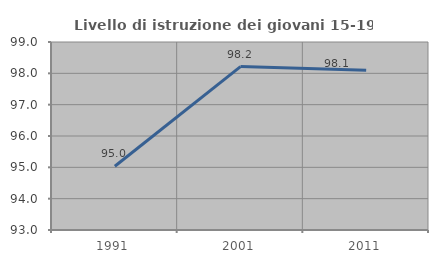
| Category | Livello di istruzione dei giovani 15-19 anni |
|---|---|
| 1991.0 | 95.035 |
| 2001.0 | 98.214 |
| 2011.0 | 98.095 |